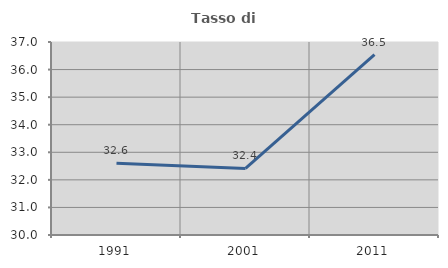
| Category | Tasso di occupazione   |
|---|---|
| 1991.0 | 32.605 |
| 2001.0 | 32.414 |
| 2011.0 | 36.538 |